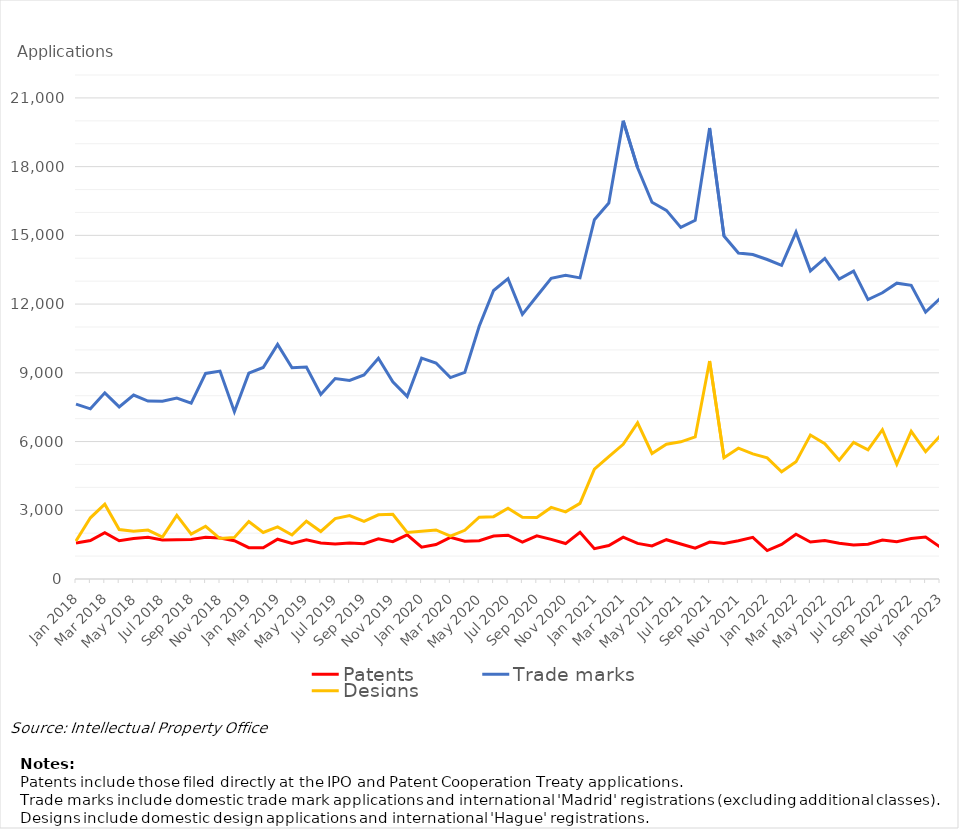
| Category | Patents | Trade marks | Designs |
|---|---|---|---|
| Jan 2018 | 1575 | 7634 | 1658 |
| Feb 2018 | 1676 | 7428 | 2672 |
| Mar 2018 | 2022 | 8127 | 3267 |
| Apr 2018 | 1670 | 7512 | 2160 |
| May 2018 | 1767 | 8030 | 2083 |
| Jun 2018 | 1821 | 7769 | 2136 |
| Jul 2018 | 1704 | 7757 | 1832 |
| Aug 2018 | 1713 | 7897 | 2777 |
| Sep 2018 | 1725 | 7673 | 1960 |
| Oct 2018 | 1818 | 8972 | 2302 |
| Nov 2018 | 1787 | 9076 | 1765 |
| Dec 2018 | 1670 | 7304 | 1815 |
| Jan 2019 | 1367 | 8985 | 2505 |
| Feb 2019 | 1361 | 9234 | 2031 |
| Mar 2019 | 1737 | 10243 | 2274 |
| Apr 2019 | 1552 | 9219 | 1923 |
| May 2019 | 1710 | 9251 | 2520 |
| Jun 2019 | 1569 | 8053 | 2074 |
| Jul 2019 | 1527 | 8752 | 2634 |
| Aug 2019 | 1571 | 8670 | 2768 |
| Sep 2019 | 1540 | 8907 | 2511 |
| Oct 2019 | 1755 | 9636 | 2800 |
| Nov 2019 | 1630 | 8607 | 2827 |
| Dec 2019 | 1926 | 7970 | 2028 |
| Jan 2020 | 1391 | 9642 | 2082 |
| Feb 2020 | 1504 | 9428 | 2143 |
| Mar 2020 | 1819 | 8794 | 1872 |
| Apr 2020 | 1648 | 9021 | 2127 |
| May 2020 | 1672 | 11035 | 2695 |
| Jun 2020 | 1879 | 12593 | 2721 |
| Jul 2020 | 1912 | 13110 | 3086 |
| Aug 2020 | 1613 | 11551 | 2695 |
| Sep 2020 | 1886 | 12340 | 2686 |
| Oct 2020 | 1730 | 13126 | 3124 |
| Nov 2020 | 1547 | 13254 | 2930 |
| Dec 2020 | 2042 | 13144 | 3302 |
| Jan 2021 | 1324 | 15685 | 4792 |
| Feb 2021 | 1462 | 16413 | 5340 |
| Mar 2021 | 1828 | 20001 | 5878 |
| Apr 2021 | 1554 | 17951 | 6815 |
| May 2021 | 1446 | 16446 | 5480 |
| Jun 2021 | 1716 | 16091 | 5881 |
| Jul 2021 | 1528 | 15345 | 5989 |
| Aug 2021 | 1344 | 15659 | 6200 |
| Sep 2021 | 1615 | 19685 | 9517 |
| Oct 2021 | 1547 | 14968 | 5292 |
| Nov 2021 | 1670 | 14232 | 5712 |
| Dec 2021 | 1818 | 14162 | 5464 |
| Jan 2022 | 1240 | 13946 | 5288 |
| Feb 2022 | 1507 | 13691 | 4683 |
| Mar 2022 | 1952 | 15142 | 5114 |
| Apr 2022 | 1617 | 13450 | 6282 |
| May 2022 | 1682 | 13992 | 5907 |
| Jun 2022 | 1559 | 13095 | 5183 |
| Jul 2022 | 1485 | 13439 | 5963 |
| Aug 2022 | 1518 | 12197 | 5639 |
| Sep 2022 | 1702 | 12493 | 6515 |
| Oct 2022 | 1630 | 12914 | 5012 |
| Nov 2022 | 1769 | 12820 | 6446 |
| Dec 2022 | 1828 | 11649 | 5558 |
| Jan 2023 | 1398 | 12240 | 6239 |